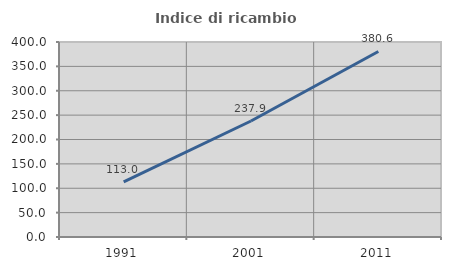
| Category | Indice di ricambio occupazionale  |
|---|---|
| 1991.0 | 112.977 |
| 2001.0 | 237.931 |
| 2011.0 | 380.556 |